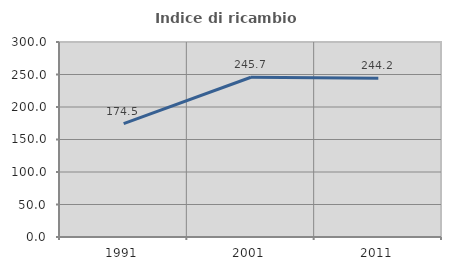
| Category | Indice di ricambio occupazionale  |
|---|---|
| 1991.0 | 174.51 |
| 2001.0 | 245.745 |
| 2011.0 | 244.248 |